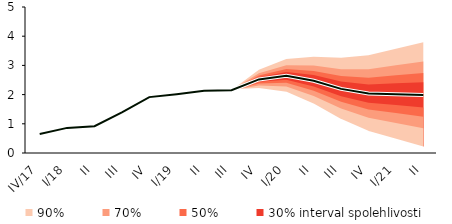
| Category | linka | Centerline |
|---|---|---|
| IV/17 | 0.654 | 0.654 |
| I/18 | 0.86 | 0.86 |
| II | 0.916 | 0.916 |
| III | 1.393 | 1.393 |
| IV | 1.913 | 1.913 |
| I/19 | 2.013 | 2.013 |
| II | 2.13 | 2.13 |
| III | 2.15 | 2.15 |
| IV | 2.519 | 2.519 |
| I/20 | 2.642 | 2.642 |
| II | 2.472 | 2.472 |
| III | 2.196 | 2.196 |
| IV | 2.035 | 2.035 |
| I/21 | 2.014 | 2.014 |
| II | 1.99 | 1.99 |